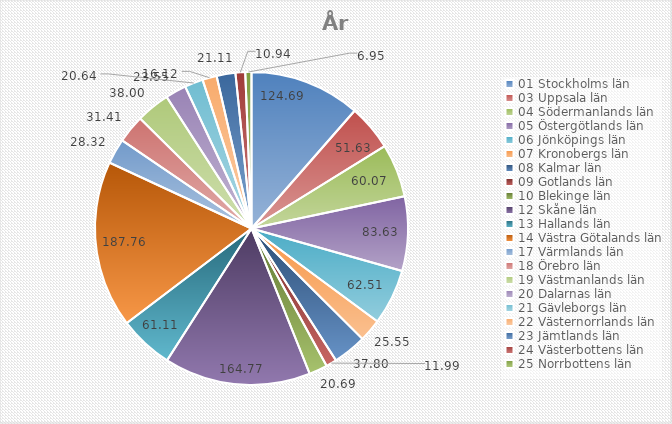
| Category | Series 0 |
|---|---|
| 01 Stockholms län | 124.69 |
| 03 Uppsala län | 51.63 |
| 04 Södermanlands län | 60.07 |
| 05 Östergötlands län | 83.63 |
| 06 Jönköpings län | 62.51 |
| 07 Kronobergs län | 25.55 |
| 08 Kalmar län | 37.8 |
| 09 Gotlands län | 11.99 |
| 10 Blekinge län | 20.69 |
| 12 Skåne län | 164.77 |
| 13 Hallands län | 61.11 |
| 14 Västra Götalands län | 187.76 |
| 17 Värmlands län | 28.32 |
| 18 Örebro län | 31.41 |
| 19 Västmanlands län | 38 |
| 20 Dalarnas län | 23.55 |
| 21 Gävleborgs län | 20.64 |
| 22 Västernorrlands län | 16.12 |
| 23 Jämtlands län | 21.11 |
| 24 Västerbottens län | 10.94 |
| 25 Norrbottens län | 6.95 |